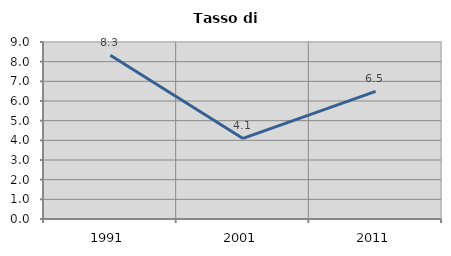
| Category | Tasso di disoccupazione   |
|---|---|
| 1991.0 | 8.328 |
| 2001.0 | 4.096 |
| 2011.0 | 6.494 |